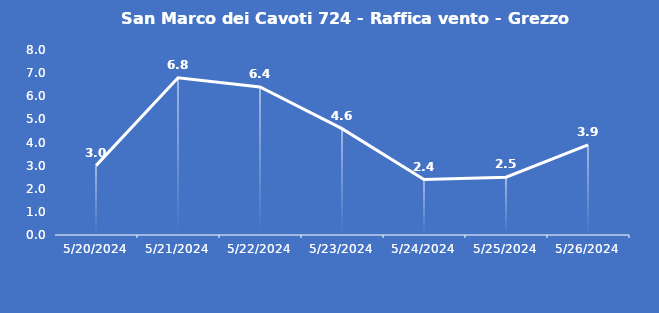
| Category | San Marco dei Cavoti 724 - Raffica vento - Grezzo (m/s) |
|---|---|
| 5/20/24 | 3 |
| 5/21/24 | 6.8 |
| 5/22/24 | 6.4 |
| 5/23/24 | 4.6 |
| 5/24/24 | 2.4 |
| 5/25/24 | 2.5 |
| 5/26/24 | 3.9 |